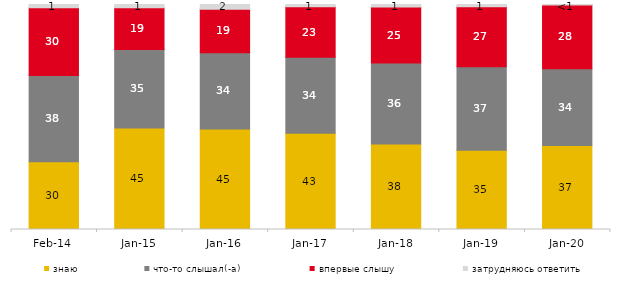
| Category | знаю | что-то слышал(-а) | впервые слышу | затрудняюсь ответить |
|---|---|---|---|---|
| 2014-02-01 | 30.15 | 38.25 | 30.15 | 1.45 |
| 2015-01-01 | 45.1 | 34.85 | 18.6 | 1.45 |
| 2016-01-01 | 44.65 | 33.9 | 19.35 | 2.1 |
| 2017-01-01 | 42.8 | 33.7 | 22.55 | 0.95 |
| 2018-01-01 | 38 | 35.95 | 24.95 | 1.1 |
| 2019-01-01 | 35.2 | 37.1 | 26.75 | 0.95 |
| 2020-01-01 | 37.376 | 34.109 | 28.317 | 0.198 |